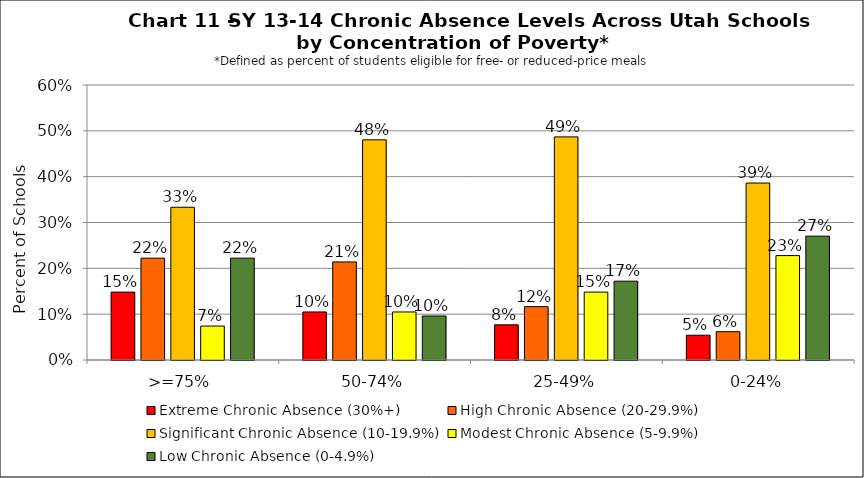
| Category | Extreme Chronic Absence (30%+) | High Chronic Absence (20-29.9%) | Significant Chronic Absence (10-19.9%) | Modest Chronic Absence (5-9.9%) | Low Chronic Absence (0-4.9%) |
|---|---|---|---|---|---|
| 0 | 0.148 | 0.222 | 0.333 | 0.074 | 0.222 |
| 1 | 0.105 | 0.214 | 0.48 | 0.105 | 0.096 |
| 2 | 0.077 | 0.116 | 0.487 | 0.148 | 0.172 |
| 3 | 0.054 | 0.062 | 0.386 | 0.228 | 0.27 |